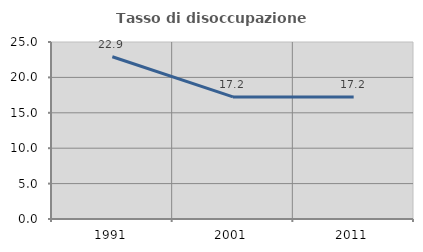
| Category | Tasso di disoccupazione giovanile  |
|---|---|
| 1991.0 | 22.917 |
| 2001.0 | 17.241 |
| 2011.0 | 17.241 |